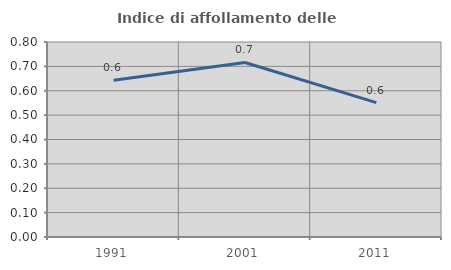
| Category | Indice di affollamento delle abitazioni  |
|---|---|
| 1991.0 | 0.644 |
| 2001.0 | 0.716 |
| 2011.0 | 0.551 |